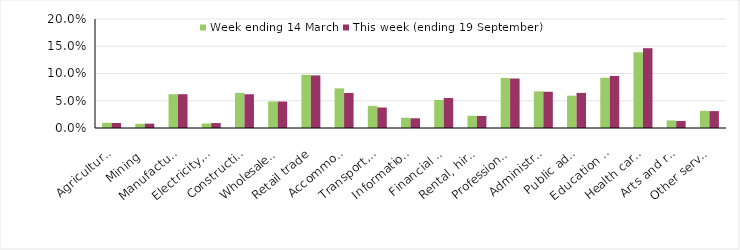
| Category | Week ending 14 March | This week (ending 19 September) |
|---|---|---|
| Agriculture, forestry and fishing | 0.01 | 0.009 |
| Mining | 0.008 | 0.008 |
| Manufacturing | 0.062 | 0.062 |
| Electricity, gas, water and waste services | 0.008 | 0.009 |
| Construction | 0.064 | 0.062 |
| Wholesale trade | 0.049 | 0.049 |
| Retail trade | 0.098 | 0.096 |
| Accommodation and food services | 0.073 | 0.064 |
| Transport, postal and warehousing | 0.041 | 0.038 |
| Information media and telecommunications | 0.019 | 0.018 |
| Financial and insurance services | 0.052 | 0.055 |
| Rental, hiring and real estate services | 0.022 | 0.022 |
| Professional, scientific and technical services | 0.092 | 0.091 |
| Administrative and support services | 0.067 | 0.066 |
| Public administration and safety | 0.059 | 0.064 |
| Education and training | 0.092 | 0.096 |
| Health care and social assistance | 0.139 | 0.146 |
| Arts and recreation services | 0.014 | 0.013 |
| Other services | 0.032 | 0.031 |